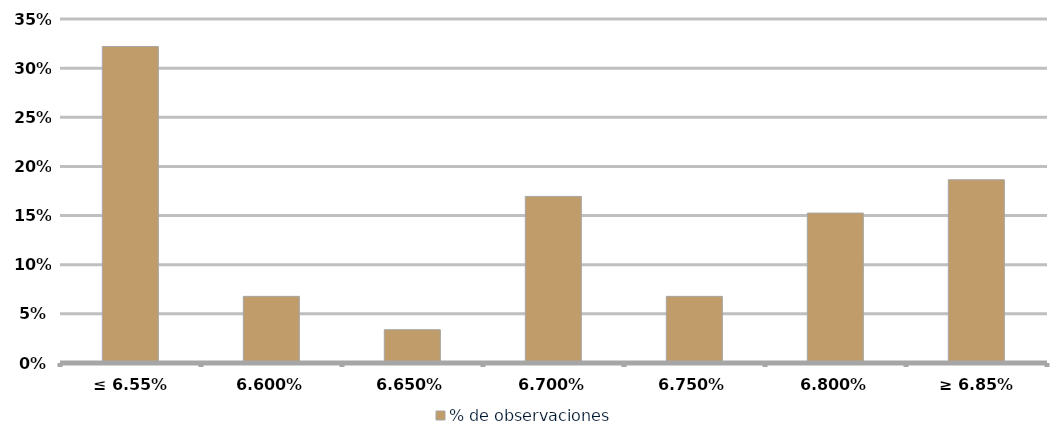
| Category | % de observaciones  |
|---|---|
| ≤ 6.55% | 0.322 |
| 6,60% | 0.068 |
| 6,65% | 0.034 |
| 6,70% | 0.169 |
| 6,75% | 0.068 |
| 6,80% | 0.153 |
| ≥ 6.85% | 0.186 |